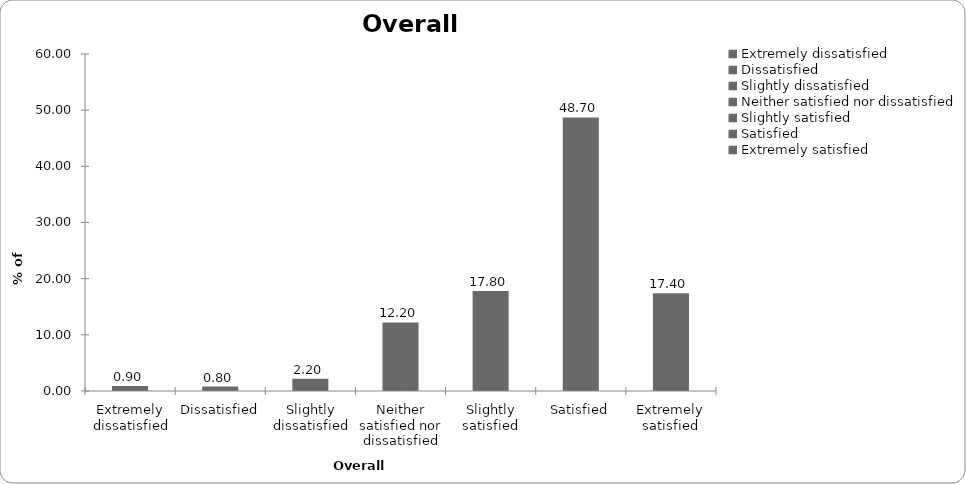
| Category | Overall satisfaction |
|---|---|
| Extremely dissatisfied | 0.9 |
| Dissatisfied | 0.8 |
| Slightly dissatisfied | 2.2 |
| Neither satisfied nor dissatisfied | 12.2 |
| Slightly satisfied | 17.8 |
| Satisfied | 48.7 |
| Extremely satisfied | 17.4 |